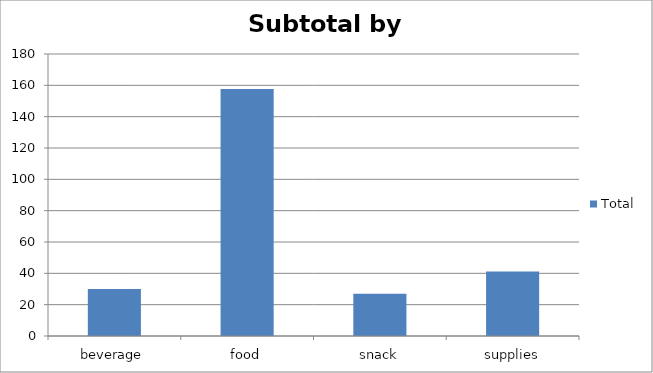
| Category | Total |
|---|---|
| beverage | 29.94 |
| food | 157.66 |
| snack | 26.95 |
| supplies | 41.12 |